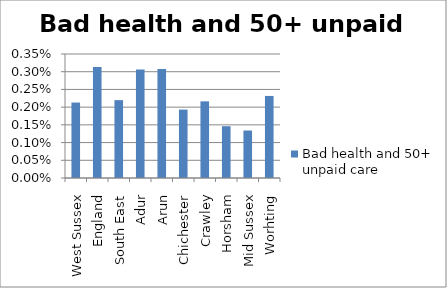
| Category | Bad health and 50+ unpaid care |
|---|---|
| West Sussex | 0.002 |
| England | 0.003 |
| South East | 0.002 |
| Adur | 0.003 |
| Arun | 0.003 |
| Chichester | 0.002 |
| Crawley | 0.002 |
| Horsham | 0.001 |
| Mid Sussex | 0.001 |
| Worhting | 0.002 |